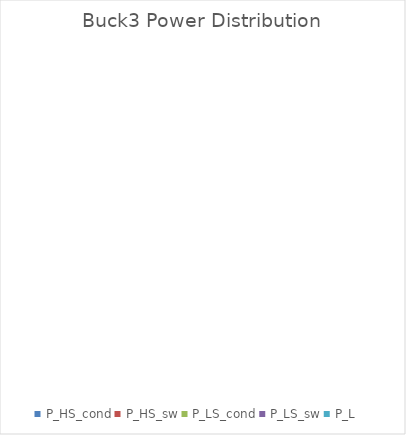
| Category | Buck3 Power Distribution |
|---|---|
| P_HS_cond | 0 |
| P_HS_sw | 0 |
| P_LS_cond | 0 |
| P_LS_sw | 0 |
| P_L | 0 |